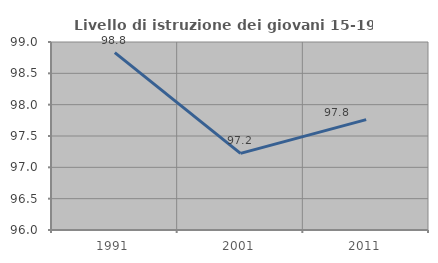
| Category | Livello di istruzione dei giovani 15-19 anni |
|---|---|
| 1991.0 | 98.83 |
| 2001.0 | 97.222 |
| 2011.0 | 97.761 |